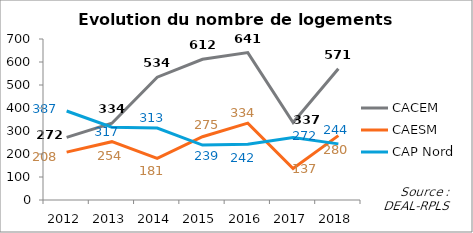
| Category | CACEM | CAESM | CAP Nord |
|---|---|---|---|
| 2012.0 | 272 | 208 | 387 |
| 2013.0 | 334.011 | 253.538 | 316.549 |
| 2014.0 | 534 | 181 | 313.017 |
| 2015.0 | 612 | 275 | 239 |
| 2016.0 | 641 | 334 | 242 |
| 2017.0 | 337 | 137 | 272 |
| 2018.0 | 571 | 280 | 244 |